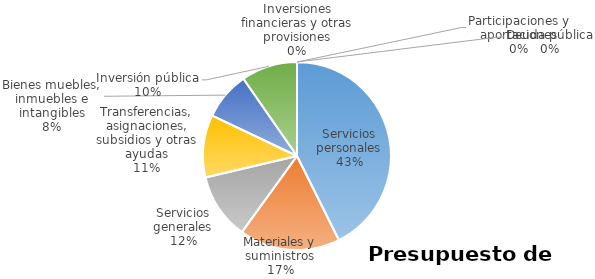
| Category | Series 0 | Series 1 | Series 2 | Series 3 | Series 4 | Series 5 |
|---|---|---|---|---|---|---|
| Servicios personales | 14223963 |  |  |  |  |  |
| Materiales y suministros | 5774044 |  |  |  |  |  |
| Servicios generales | 3785600 |  |  |  |  |  |
| Transferencias, asignaciones, subsidios y otras ayudas | 3587884 |  |  |  |  |  |
| Bienes muebles, inmuebles e intangibles | 2756237 |  |  |  |  |  |
| Inversión pública | 3219058 |  |  |  |  |  |
| Inversiones financieras y otras provisiones | 0 |  |  |  |  |  |
| Participaciones y aportaciones | 0 |  |  |  |  |  |
| Deuda pública | 0 |  |  |  |  |  |